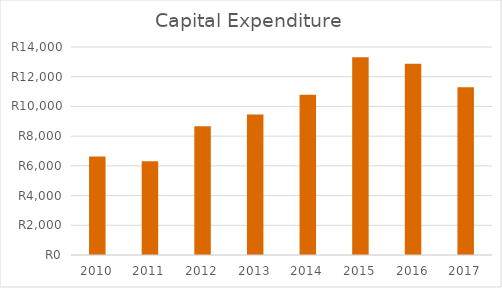
| Category | Capital Expenditure |
|---|---|
| 2010.0 | 6636 |
| 2011.0 | 6311 |
| 2012.0 | 8662 |
| 2013.0 | 9456 |
| 2014.0 | 10779 |
| 2015.0 | 13305 |
| 2016.0 | 12875 |
| 2017.0 | 11292 |